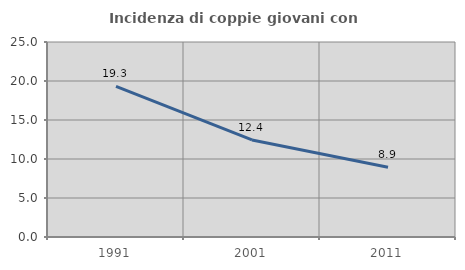
| Category | Incidenza di coppie giovani con figli |
|---|---|
| 1991.0 | 19.318 |
| 2001.0 | 12.439 |
| 2011.0 | 8.932 |